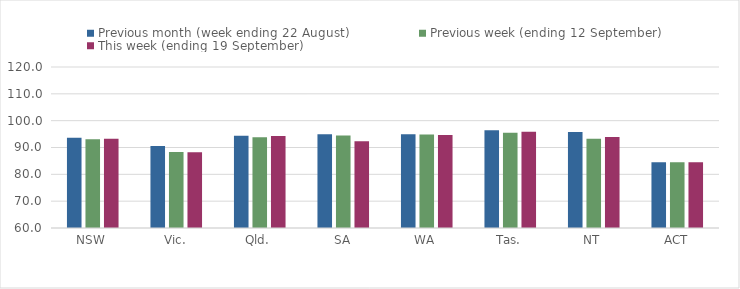
| Category | Previous month (week ending 22 August) | Previous week (ending 12 September) | This week (ending 19 September) |
|---|---|---|---|
| NSW | 93.67 | 93.11 | 93.22 |
| Vic. | 90.58 | 88.32 | 88.22 |
| Qld. | 94.37 | 93.83 | 94.3 |
| SA | 94.95 | 94.49 | 92.36 |
| WA | 94.93 | 94.89 | 94.7 |
| Tas. | 96.41 | 95.5 | 95.84 |
| NT | 95.77 | 93.28 | 93.92 |
| ACT | 84.54 | 84.54 | 84.54 |